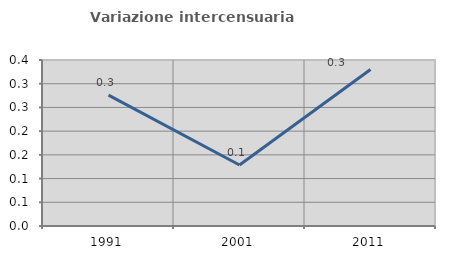
| Category | Variazione intercensuaria annua |
|---|---|
| 1991.0 | 0.276 |
| 2001.0 | 0.129 |
| 2011.0 | 0.33 |